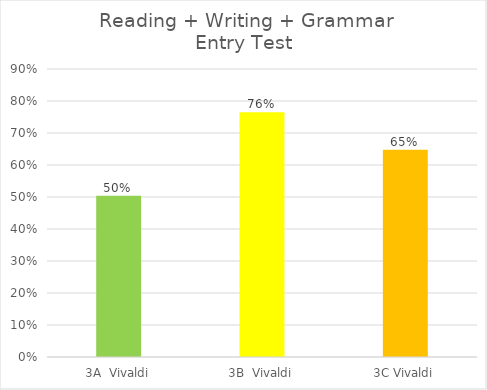
| Category | Reading + Writing + Grammar
Entry Test |
|---|---|
| 3A  Vivaldi | 0.504 |
| 3B  Vivaldi | 0.765 |
| 3C Vivaldi | 0.647 |